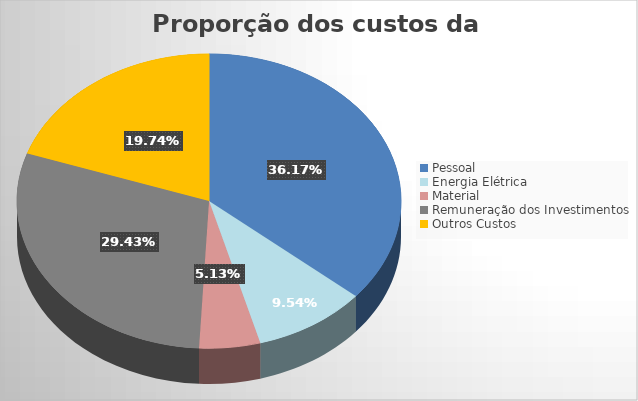
| Category | Series 0 |
|---|---|
| Pessoal | 515403108.978 |
| Energia Elétrica | 135923148.233 |
| Material  | 73053331.885 |
| Remuneração dos Investimentos | 419369708.617 |
| Outros Custos | 281380973.029 |